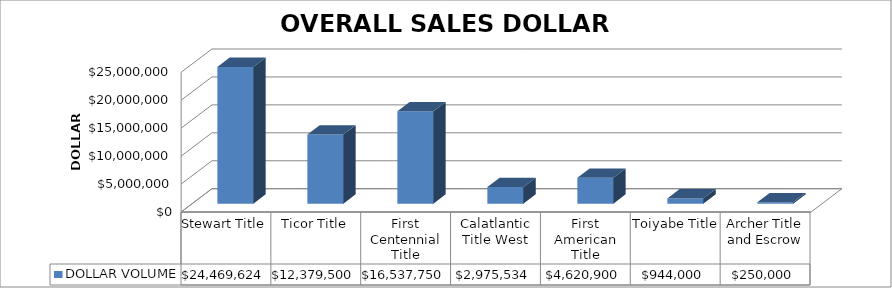
| Category | DOLLAR VOLUME |
|---|---|
| Stewart Title | 24469624 |
| Ticor Title | 12379500 |
| First Centennial Title | 16537750 |
| Calatlantic Title West | 2975534 |
| First American Title | 4620900 |
| Toiyabe Title | 944000 |
| Archer Title and Escrow | 250000 |